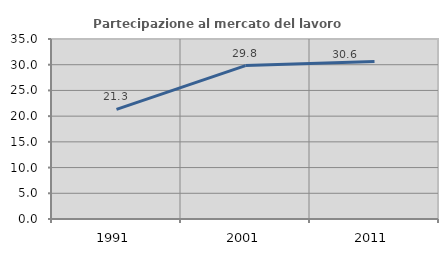
| Category | Partecipazione al mercato del lavoro  femminile |
|---|---|
| 1991.0 | 21.311 |
| 2001.0 | 29.829 |
| 2011.0 | 30.641 |